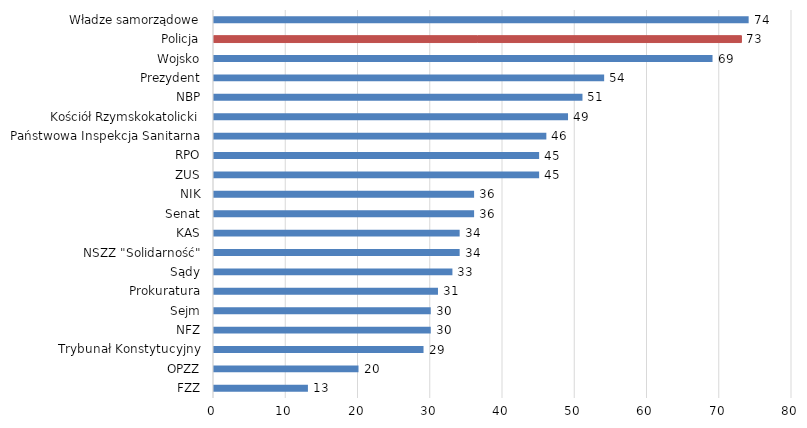
| Category | Series 0 |
|---|---|
| FZZ | 13 |
| OPZZ | 20 |
| Trybunał Konstytucyjny | 29 |
| NFZ | 30 |
| Sejm | 30 |
| Prokuratura | 31 |
| Sądy | 33 |
| NSZZ "Solidarność" | 34 |
| KAS | 34 |
| Senat | 36 |
| NIK | 36 |
| ZUS | 45 |
| RPO | 45 |
| Państwowa Inspekcja Sanitarna | 46 |
| Kościół Rzymskokatolicki | 49 |
| NBP | 51 |
| Prezydent | 54 |
| Wojsko | 69 |
| Policja | 73 |
| Władze samorządowe | 74 |